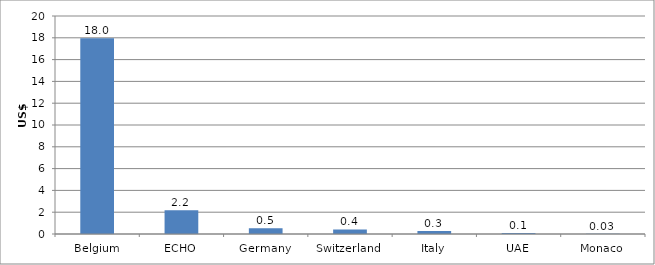
| Category | US$ millions |
|---|---|
| Belgium | 17.955 |
| ECHO | 2.188 |
| Germany | 0.52 |
| Switzerland | 0.422 |
| Italy | 0.274 |
| UAE | 0.103 |
| Monaco | 0.033 |